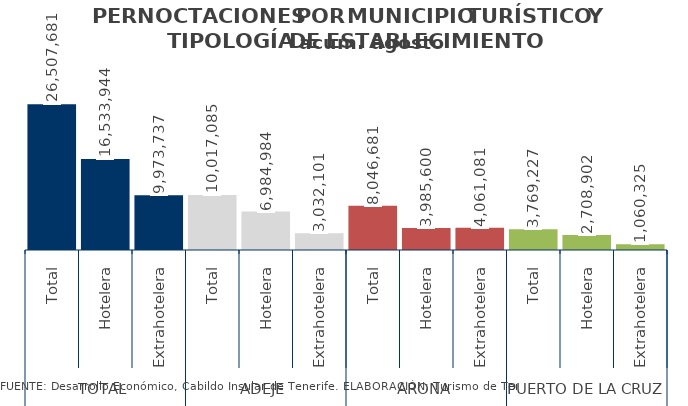
| Category | acum. agosto 2014 |
|---|---|
| 0 | 26507681 |
| 1 | 16533944 |
| 2 | 9973737 |
| 3 | 10017085 |
| 4 | 6984984 |
| 5 | 3032101 |
| 6 | 8046681 |
| 7 | 3985600 |
| 8 | 4061081 |
| 9 | 3769227 |
| 10 | 2708902 |
| 11 | 1060325 |